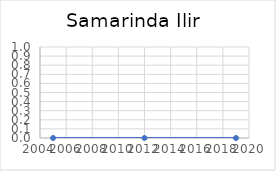
| Category | Series 0 |
|---|---|
| 2005.0 | 0 |
| 2012.0 | 0 |
| 2019.0 | 0 |